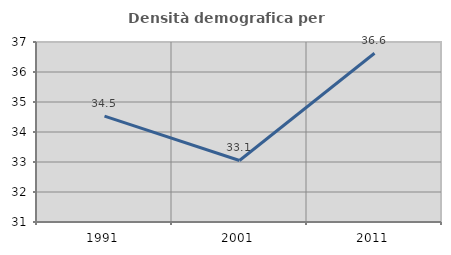
| Category | Densità demografica |
|---|---|
| 1991.0 | 34.53 |
| 2001.0 | 33.051 |
| 2011.0 | 36.624 |